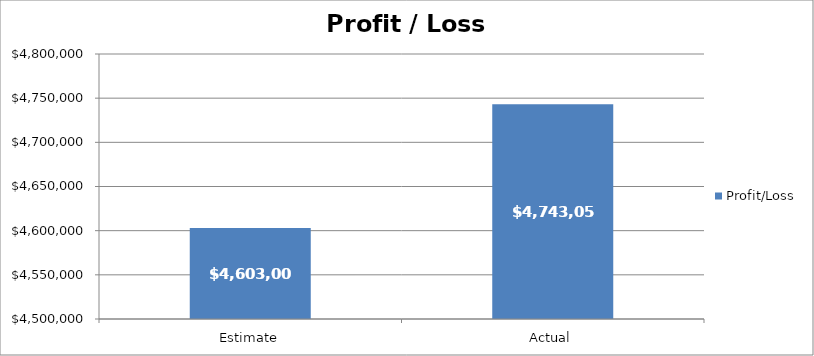
| Category | Profit/Loss |
|---|---|
| Estimate | 4603000 |
| Actual | 4743050 |